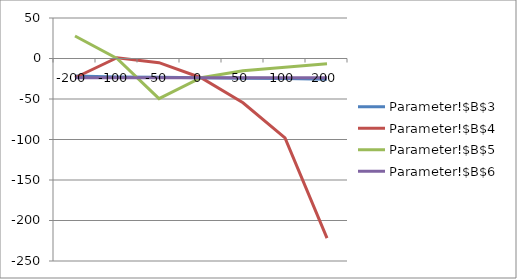
| Category | Parameter!$B$3 | Parameter!$B$4 | Parameter!$B$5 | Parameter!$B$6 |
|---|---|---|---|---|
| -200.0 | -21.75 | -23.75 | 27.75 | -23.75 |
| -100.0 | -22.75 | 1 | 0 | -23.75 |
| -50.0 | -23.25 | -5.188 | -49.5 | -23.75 |
| 0.0 | -23.75 | -23.75 | -23.75 | -23.75 |
| 50.0 | -24.25 | -54.688 | -15.167 | -23.75 |
| 100.0 | -24.75 | -98 | -10.875 | -23.75 |
| 200.0 | -25.75 | -221.75 | -6.583 | -23.75 |